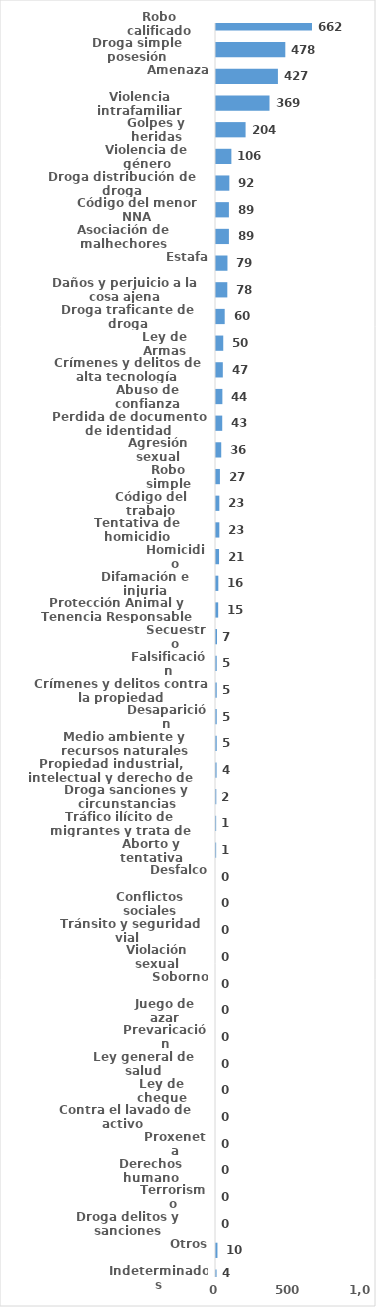
| Category | Series 0 |
|---|---|
| Robo calificado | 662 |
| Droga simple posesión | 478 |
| Amenaza | 427 |
| Violencia intrafamiliar | 369 |
| Golpes y heridas | 204 |
| Violencia de género | 106 |
| Droga distribución de droga | 92 |
| Código del menor NNA | 89 |
| Asociación de malhechores | 89 |
| Estafa | 79 |
| Daños y perjuicio a la cosa ajena | 78 |
| Droga traficante de droga | 60 |
| Ley de Armas | 50 |
| Crímenes y delitos de alta tecnología | 47 |
| Abuso de confianza | 44 |
| Perdida de documento de identidad | 43 |
| Agresión sexual | 36 |
| Robo simple | 27 |
| Código del trabajo | 23 |
| Tentativa de homicidio | 23 |
| Homicidio | 21 |
| Difamación e injuria | 16 |
| Protección Animal y Tenencia Responsable | 15 |
| Secuestro | 7 |
| Falsificación | 5 |
| Crímenes y delitos contra la propiedad | 5 |
| Desaparición | 5 |
| Medio ambiente y recursos naturales | 5 |
| Propiedad industrial, intelectual y derecho de autor | 4 |
| Droga sanciones y circunstancias agravantes | 2 |
| Tráfico ilícito de migrantes y trata de personas | 1 |
| Aborto y tentativa | 1 |
| Desfalco | 0 |
| Conflictos sociales | 0 |
| Tránsito y seguridad vial  | 0 |
| Violación sexual | 0 |
| Soborno | 0 |
| Juego de azar | 0 |
| Prevaricación | 0 |
| Ley general de salud | 0 |
| Ley de cheque | 0 |
| Contra el lavado de activo  | 0 |
| Proxeneta | 0 |
| Derechos humano | 0 |
| Terrorismo | 0 |
| Droga delitos y sanciones | 0 |
| Otros | 10 |
| Indeterminados | 4 |